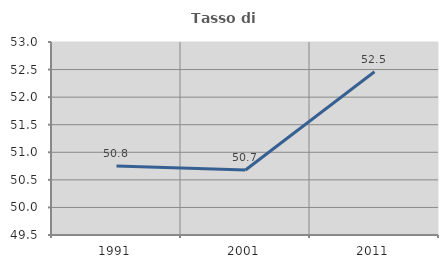
| Category | Tasso di occupazione   |
|---|---|
| 1991.0 | 50.751 |
| 2001.0 | 50.679 |
| 2011.0 | 52.461 |